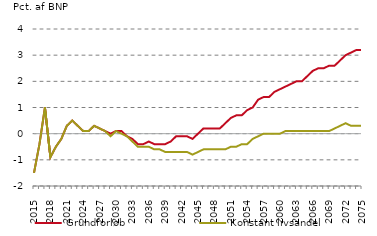
| Category | nul-linje | Grundforløb | Konstant livsandel  |
|---|---|---|---|
| 2015.0 | 0 | -1.5 | -1.5 |
| 2016.0 | 0 | -0.4 | -0.4 |
| 2017.0 | 0 | 1 | 1 |
| 2018.0 | 0 | -0.9 | -0.9 |
| 2019.0 | 0 | -0.5 | -0.5 |
| 2020.0 | 0 | -0.2 | -0.2 |
| 2021.0 | 0 | 0.3 | 0.3 |
| 2022.0 | 0 | 0.5 | 0.5 |
| 2023.0 | 0 | 0.3 | 0.3 |
| 2024.0 | 0 | 0.1 | 0.1 |
| 2025.0 | 0 | 0.1 | 0.1 |
| 2026.0 | 0 | 0.3 | 0.3 |
| 2027.0 | 0 | 0.2 | 0.2 |
| 2028.0 | 0 | 0.1 | 0.1 |
| 2029.0 | 0 | 0 | -0.1 |
| 2030.0 | 0 | 0.1 | 0.1 |
| 2031.0 | 0 | 0.1 | 0 |
| 2032.0 | 0 | -0.1 | -0.1 |
| 2033.0 | 0 | -0.2 | -0.3 |
| 2034.0 | 0 | -0.4 | -0.5 |
| 2035.0 | 0 | -0.4 | -0.5 |
| 2036.0 | 0 | -0.3 | -0.5 |
| 2037.0 | 0 | -0.4 | -0.6 |
| 2038.0 | 0 | -0.4 | -0.6 |
| 2039.0 | 0 | -0.4 | -0.7 |
| 2040.0 | 0 | -0.3 | -0.7 |
| 2041.0 | 0 | -0.1 | -0.7 |
| 2042.0 | 0 | -0.1 | -0.7 |
| 2043.0 | 0 | -0.1 | -0.7 |
| 2044.0 | 0 | -0.2 | -0.8 |
| 2045.0 | 0 | 0 | -0.7 |
| 2046.0 | 0 | 0.2 | -0.6 |
| 2047.0 | 0 | 0.2 | -0.6 |
| 2048.0 | 0 | 0.2 | -0.6 |
| 2049.0 | 0 | 0.2 | -0.6 |
| 2050.0 | 0 | 0.4 | -0.6 |
| 2051.0 | 0 | 0.6 | -0.5 |
| 2052.0 | 0 | 0.7 | -0.5 |
| 2053.0 | 0 | 0.7 | -0.4 |
| 2054.0 | 0 | 0.9 | -0.4 |
| 2055.0 | 0 | 1 | -0.2 |
| 2056.0 | 0 | 1.3 | -0.1 |
| 2057.0 | 0 | 1.4 | 0 |
| 2058.0 | 0 | 1.4 | 0 |
| 2059.0 | 0 | 1.6 | 0 |
| 2060.0 | 0 | 1.7 | 0 |
| 2061.0 | 0 | 1.8 | 0.1 |
| 2062.0 | 0 | 1.9 | 0.1 |
| 2063.0 | 0 | 2 | 0.1 |
| 2064.0 | 0 | 2 | 0.1 |
| 2065.0 | 0 | 2.2 | 0.1 |
| 2066.0 | 0 | 2.4 | 0.1 |
| 2067.0 | 0 | 2.5 | 0.1 |
| 2068.0 | 0 | 2.5 | 0.1 |
| 2069.0 | 0 | 2.6 | 0.1 |
| 2070.0 | 0 | 2.6 | 0.2 |
| 2071.0 | 0 | 2.8 | 0.3 |
| 2072.0 | 0 | 3 | 0.4 |
| 2073.0 | 0 | 3.1 | 0.3 |
| 2074.0 | 0 | 3.2 | 0.3 |
| 2075.0 | 0 | 3.2 | 0.3 |